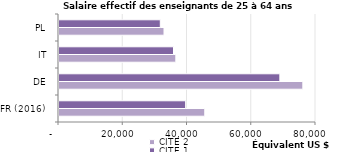
| Category | CITE 2 | CITE 1 |
|---|---|---|
| FR (2016) | 45374.73 | 39426.288 |
| DE | 75903.698 | 68747.008 |
| IT | 36363.128 | 35646.852 |
| PL | 32687.852 | 31535.346 |